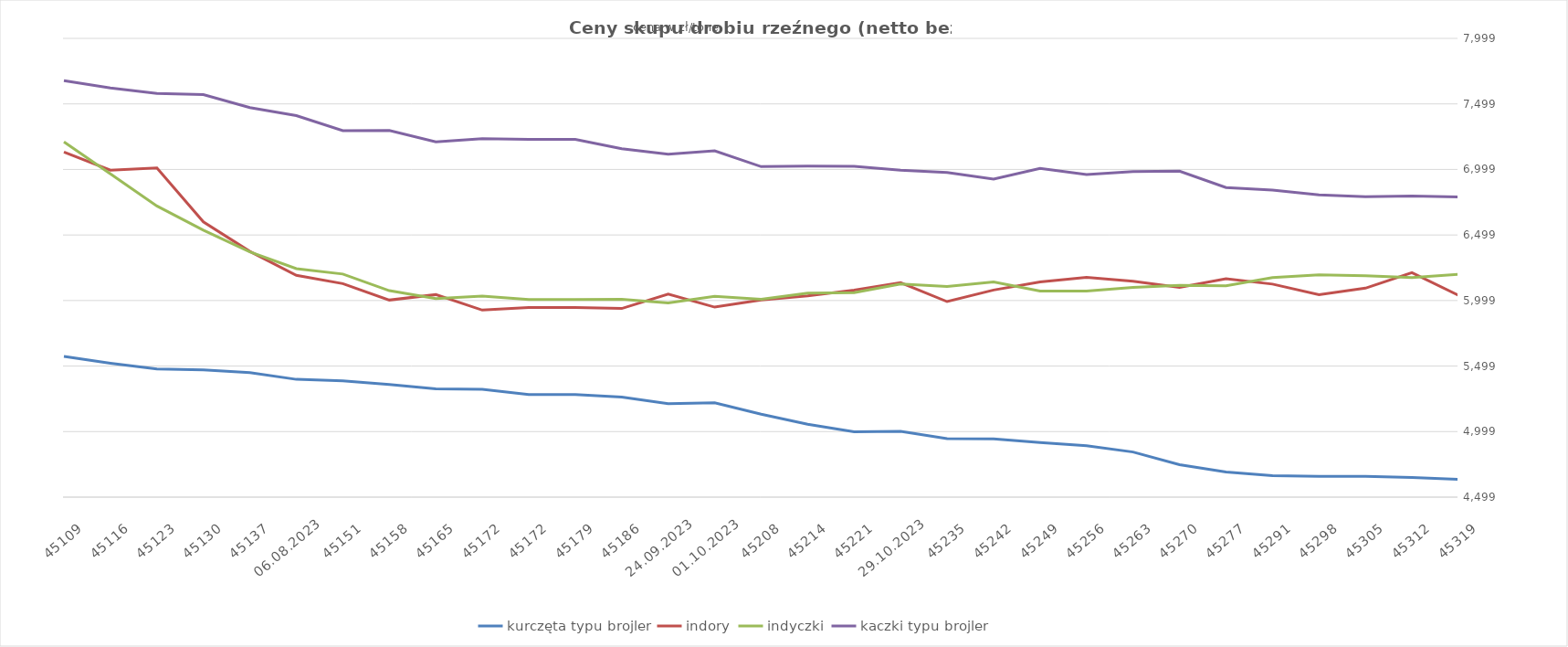
| Category | kurczęta typu brojler | indory | indyczki | kaczki typu brojler |
|---|---|---|---|---|
| 45109 | 5572.649 | 7132.179 | 7209.596 | 7676.296 |
| 45116 | 5520.851 | 6993.673 | 6965.991 | 7621.335 |
| 45123 | 5476.43 | 7010.317 | 6720.327 | 7578.315 |
| 45130 | 5470.211 | 6598.732 | 6536.334 | 7570.15 |
| 45137 | 5449.412 | 6373.906 | 6369.803 | 7471.012 |
| 06.08.2023 | 5397.637 | 6191.071 | 6242.178 | 7409.468 |
| 45151 | 5385.454 | 6127.86 | 6201.159 | 7295.213 |
| 45158 | 5359.126 | 6002.487 | 6074.145 | 7296.245 |
| 45165 | 5324.709 | 6043.999 | 6013.226 | 7210.073 |
| 45172 | 5321.699 | 5926.09 | 6032.508 | 7234.167 |
| 45172 | 5282.399 | 5945.587 | 6006.143 | 7227.811 |
| 45179 | 5282.399 | 5945.587 | 6006.143 | 7227.811 |
| 45186 | 5262.226 | 5938.105 | 6008.909 | 7157.426 |
| 24.09.2023 | 5211.947 | 6048.561 | 5980.256 | 7114.826 |
| 01.10.2023 | 5218.857 | 5948.552 | 6030.708 | 7140.721 |
| 45208 | 5132.151 | 6002.822 | 6007.94 | 7020.801 |
| 45214 | 5054.795 | 6034.902 | 6055.58 | 7024.484 |
| 45221 | 4997.36 | 6077.463 | 6059.844 | 7023.508 |
| 29.10.2023 | 5001.703 | 6135.441 | 6124.846 | 6994.05 |
| 45235 | 4944.86 | 5990.863 | 6106.435 | 6975.531 |
| 45242 | 4944.106 | 6078.918 | 6140.869 | 6924.847 |
| 45249 | 4915.638 | 6140.738 | 6071.814 | 7007.246 |
| 45256 | 4891.702 | 6174.991 | 6071.043 | 6960.805 |
| 45263 | 4843.249 | 6146.486 | 6098.344 | 6983.294 |
| 45270 | 4746.189 | 6099.471 | 6114.157 | 6986.487 |
| 45277 | 4690.731 | 6164.885 | 6111.197 | 6861.194 |
| 45291 | 4663.689 | 6124.488 | 6173.581 | 6842.093 |
| 45298 | 4656.999 | 6042.899 | 6195.536 | 6804.711 |
| 45305 | 4657.301 | 6093.408 | 6188.469 | 6791.49 |
| 45312 | 4649.368 | 6211.743 | 6174.662 | 6795.51 |
| 45319 | 4635.346 | 6038.883 | 6198.268 | 6789.984 |